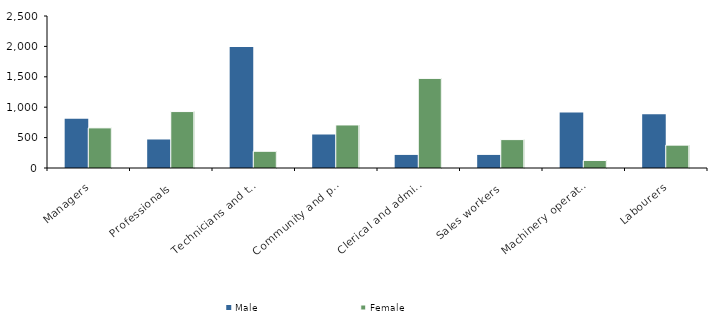
| Category | Male | Female |
|---|---|---|
| Managers | 812 | 660 |
| Professionals | 469 | 928 |
| Technicians and trades workers | 1990 | 275 |
| Community and personal service workers | 551 | 708 |
| Clerical and administrative workers | 215 | 1474 |
| Sales workers | 215 | 467 |
| Machinery operators and drivers | 911 | 124 |
| Labourers | 886 | 376 |